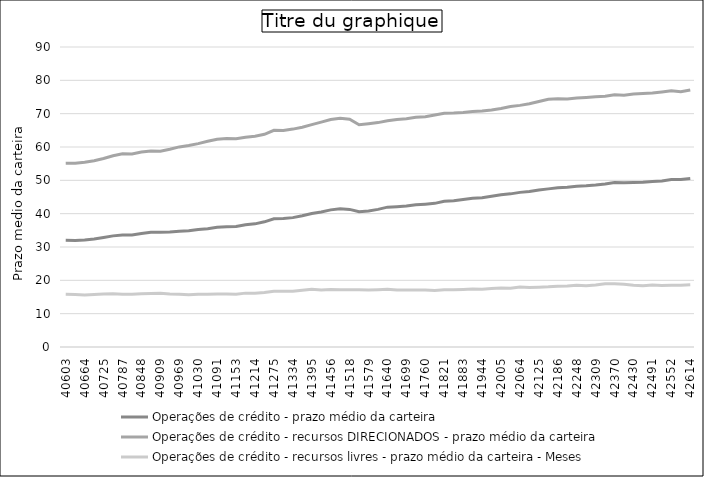
| Category | Operações de crédito - prazo médio da carteira  | Operações de crédito - recursos DIRECIONADOS - prazo médio da carteira  | Operações de crédito - recursos livres - prazo médio da carteira - Meses |
|---|---|---|---|
| 40603.0 | 32.05 | 55.1 | 15.84 |
| 40634.0 | 31.98 | 55.15 | 15.74 |
| 40664.0 | 32.09 | 55.43 | 15.63 |
| 40695.0 | 32.38 | 55.88 | 15.76 |
| 40725.0 | 32.84 | 56.56 | 15.92 |
| 40756.0 | 33.34 | 57.36 | 15.99 |
| 40787.0 | 33.59 | 57.98 | 15.82 |
| 40817.0 | 33.62 | 57.91 | 15.86 |
| 40848.0 | 34.05 | 58.5 | 15.98 |
| 40878.0 | 34.4 | 58.81 | 16.08 |
| 40909.0 | 34.45 | 58.7 | 16.14 |
| 40940.0 | 34.5 | 59.33 | 15.91 |
| 40969.0 | 34.72 | 60.03 | 15.81 |
| 41000.0 | 34.85 | 60.43 | 15.7 |
| 41030.0 | 35.23 | 61.01 | 15.8 |
| 41061.0 | 35.5 | 61.7 | 15.85 |
| 41091.0 | 35.92 | 62.32 | 15.88 |
| 41122.0 | 36.11 | 62.53 | 15.87 |
| 41153.0 | 36.13 | 62.51 | 15.84 |
| 41183.0 | 36.68 | 62.95 | 16.16 |
| 41214.0 | 36.94 | 63.25 | 16.15 |
| 41244.0 | 37.55 | 63.8 | 16.37 |
| 41275.0 | 38.48 | 65.02 | 16.71 |
| 41306.0 | 38.56 | 64.96 | 16.74 |
| 41334.0 | 38.81 | 65.37 | 16.74 |
| 41365.0 | 39.38 | 65.92 | 17 |
| 41395.0 | 40.06 | 66.7 | 17.31 |
| 41426.0 | 40.5 | 67.45 | 17.12 |
| 41456.0 | 41.14 | 68.24 | 17.24 |
| 41487.0 | 41.49 | 68.64 | 17.14 |
| 41518.0 | 41.28 | 68.31 | 17.15 |
| 41548.0 | 40.61 | 66.67 | 17.21 |
| 41579.0 | 40.82 | 66.99 | 17.11 |
| 41609.0 | 41.29 | 67.32 | 17.18 |
| 41640.0 | 41.96 | 67.87 | 17.29 |
| 41671.0 | 42.11 | 68.28 | 17.1 |
| 41699.0 | 42.27 | 68.48 | 17.07 |
| 41730.0 | 42.66 | 68.89 | 17.11 |
| 41760.0 | 42.86 | 69.05 | 17.11 |
| 41791.0 | 43.09 | 69.59 | 16.98 |
| 41821.0 | 43.73 | 70.13 | 17.21 |
| 41852.0 | 43.88 | 70.17 | 17.16 |
| 41883.0 | 44.23 | 70.37 | 17.26 |
| 41913.0 | 44.62 | 70.67 | 17.4 |
| 41944.0 | 44.75 | 70.82 | 17.36 |
| 41974.0 | 45.21 | 71.11 | 17.58 |
| 42005.0 | 45.65 | 71.57 | 17.68 |
| 42036.0 | 45.94 | 72.14 | 17.63 |
| 42064.0 | 46.39 | 72.49 | 17.98 |
| 42095.0 | 46.62 | 72.97 | 17.82 |
| 42125.0 | 47.1 | 73.65 | 17.94 |
| 42156.0 | 47.44 | 74.3 | 18.04 |
| 42186.0 | 47.79 | 74.46 | 18.25 |
| 42217.0 | 47.9 | 74.4 | 18.3 |
| 42248.0 | 48.25 | 74.72 | 18.51 |
| 42278.0 | 48.36 | 74.87 | 18.39 |
| 42309.0 | 48.59 | 75.04 | 18.6 |
| 42339.0 | 48.91 | 75.23 | 18.94 |
| 42370.0 | 49.35 | 75.65 | 18.95 |
| 42401.0 | 49.26 | 75.51 | 18.84 |
| 42430.0 | 49.34 | 75.87 | 18.55 |
| 42461.0 | 49.43 | 76.02 | 18.4 |
| 42491.0 | 49.64 | 76.17 | 18.57 |
| 42522.0 | 49.82 | 76.48 | 18.42 |
| 42552.0 | 50.23 | 76.84 | 18.49 |
| 42583.0 | 50.24 | 76.57 | 18.53 |
| 42614.0 | 50.55 | 77.07 | 18.64 |